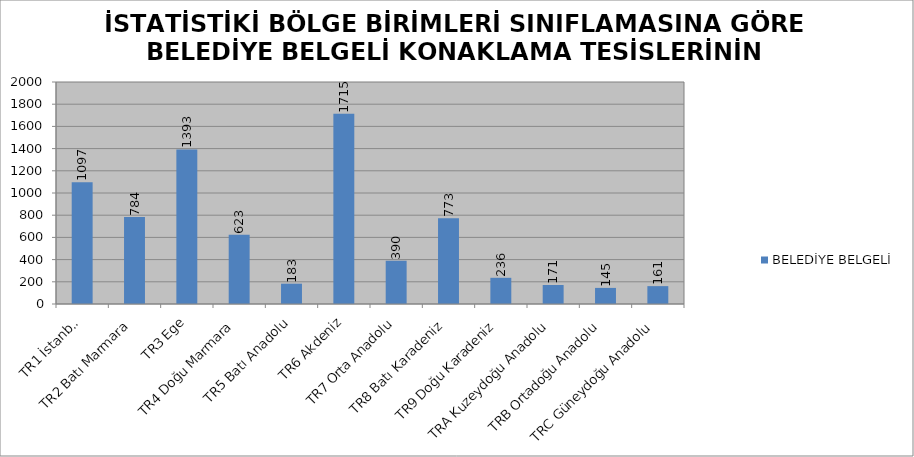
| Category | BELEDİYE BELGELİ |
|---|---|
| TR1 İstanbul | 1097 |
| TR2 Batı Marmara | 784 |
| TR3 Ege | 1393 |
| TR4 Doğu Marmara | 623 |
| TR5 Batı Anadolu | 183 |
| TR6 Akdeniz | 1715 |
| TR7 Orta Anadolu | 390 |
| TR8 Batı Karadeniz | 773 |
| TR9 Doğu Karadeniz | 236 |
| TRA Kuzeydoğu Anadolu | 171 |
| TRB Ortadoğu Anadolu | 145 |
| TRC Güneydoğu Anadolu | 161 |